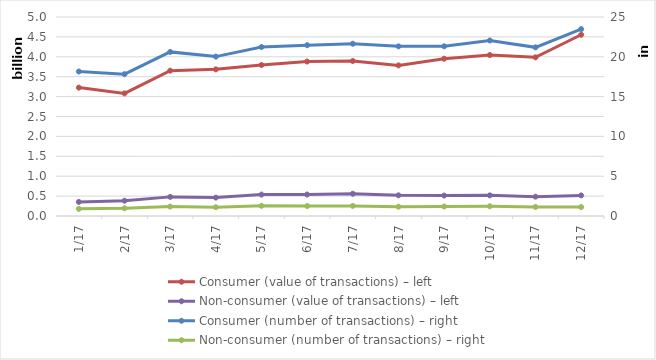
| Category | Consumer (value of transactions) – left | Non-consumer (value of transactions) – left |
|---|---|---|
| 2017-01-01 | 3225827387 | 353604472 |
| 2017-02-01 | 3080840128 | 384222343 |
| 2017-03-01 | 3651710668 | 480399410 |
| 2017-04-01 | 3684325852 | 461868775 |
| 2017-05-01 | 3793662101 | 537883365 |
| 2017-06-01 | 3880550199 | 539850885 |
| 2017-07-01 | 3894782260 | 559409654 |
| 2017-08-01 | 3784157904 | 519650935 |
| 2017-09-01 | 3952180930 | 513832950 |
| 2017-10-01 | 4043739929 | 518353201 |
| 2017-11-01 | 3986366128 | 486140325 |
| 2017-12-01 | 4553339068 | 517079860 |